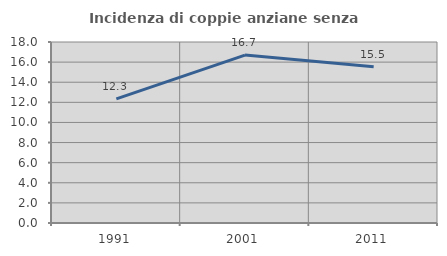
| Category | Incidenza di coppie anziane senza figli  |
|---|---|
| 1991.0 | 12.348 |
| 2001.0 | 16.701 |
| 2011.0 | 15.543 |